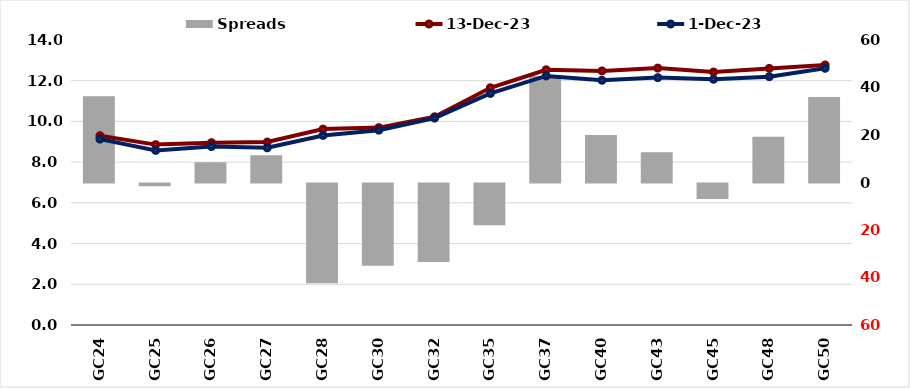
| Category |  Spreads   |
|---|---|
| GC24 | 36.347 |
| GC25 | -1.168 |
| GC26 | 8.498 |
| GC27 | 11.497 |
| GC28 | -41.991 |
| GC30 | -34.672 |
| GC32 | -33.088 |
| GC35 | -17.615 |
| GC37 | 44.793 |
| GC40 | 19.991 |
| GC43 | 12.757 |
| GC45 | -6.477 |
| GC48 | 19.303 |
| GC50 | 36.045 |